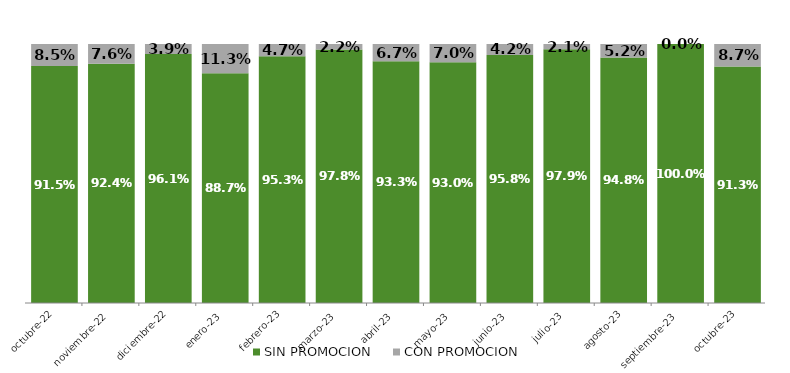
| Category | SIN PROMOCION   | CON PROMOCION   |
|---|---|---|
| 2022-10-01 | 0.915 | 0.085 |
| 2022-11-01 | 0.924 | 0.076 |
| 2022-12-01 | 0.961 | 0.039 |
| 2023-01-01 | 0.887 | 0.113 |
| 2023-02-01 | 0.953 | 0.047 |
| 2023-03-01 | 0.978 | 0.022 |
| 2023-04-01 | 0.933 | 0.067 |
| 2023-05-01 | 0.93 | 0.07 |
| 2023-06-01 | 0.958 | 0.042 |
| 2023-07-01 | 0.979 | 0.021 |
| 2023-08-01 | 0.948 | 0.052 |
| 2023-09-01 | 1 | 0 |
| 2023-10-01 | 0.913 | 0.087 |